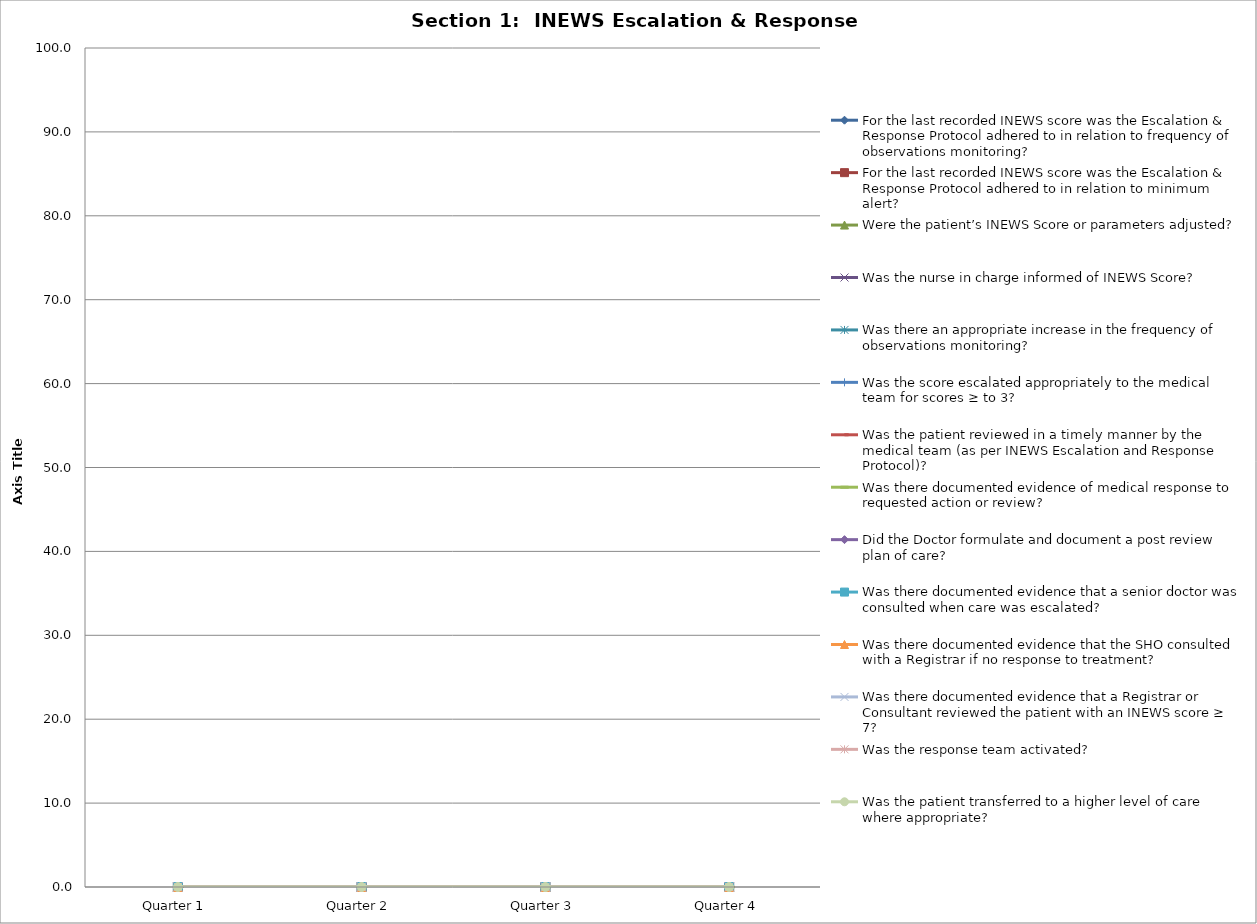
| Category | For the last recorded INEWS score was the Escalation & Response Protocol adhered to in relation to frequency of observations monitoring? | For the last recorded INEWS score was the Escalation & Response Protocol adhered to in relation to minimum alert? | Were the patient’s INEWS Score or parameters adjusted? | Was the nurse in charge informed of INEWS Score? | Was there an appropriate increase in the frequency of observations monitoring? | Was the score escalated appropriately to the medical team for scores ≥ to 3? | Was the patient reviewed in a timely manner by the medical team (as per INEWS Escalation and Response Protocol)? | Was there documented evidence of medical response to requested action or review? | Did the Doctor formulate and document a post review plan of care? | Was there documented evidence that a senior doctor was consulted when care was escalated? | Was there documented evidence that the SHO consulted with a Registrar if no response to treatment? | Was there documented evidence that a Registrar or Consultant reviewed the patient with an INEWS score ≥ 7? | Was the response team activated? | Was the patient transferred to a higher level of care where appropriate? |
|---|---|---|---|---|---|---|---|---|---|---|---|---|---|---|
| Quarter 1 | 0 | 0 | 0 | 0 | 0 | 0 | 0 | 0 | 0 | 0 | 0 | 0 | 0 | 0 |
| Quarter 2 | 0 | 0 | 0 | 0 | 0 | 0 | 0 | 0 | 0 | 0 | 0 | 0 | 0 | 0 |
| Quarter 3 | 0 | 0 | 0 | 0 | 0 | 0 | 0 | 0 | 0 | 0 | 0 | 0 | 0 | 0 |
| Quarter 4 | 0 | 0 | 0 | 0 | 0 | 0 | 0 | 0 | 0 | 0 | 0 | 0 | 0 | 0 |